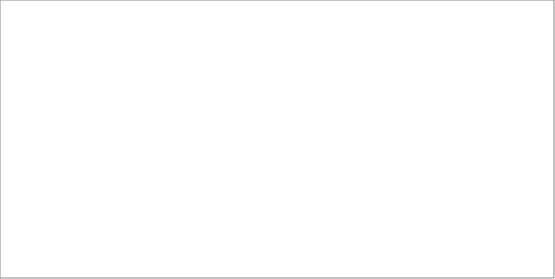
| Category | 2004 |
|---|---|
| Belgia | 1152 |